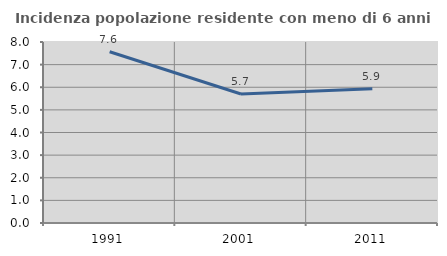
| Category | Incidenza popolazione residente con meno di 6 anni |
|---|---|
| 1991.0 | 7.571 |
| 2001.0 | 5.703 |
| 2011.0 | 5.931 |